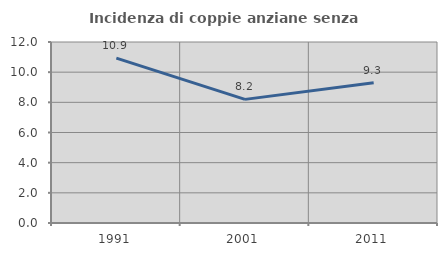
| Category | Incidenza di coppie anziane senza figli  |
|---|---|
| 1991.0 | 10.929 |
| 2001.0 | 8.197 |
| 2011.0 | 9.302 |